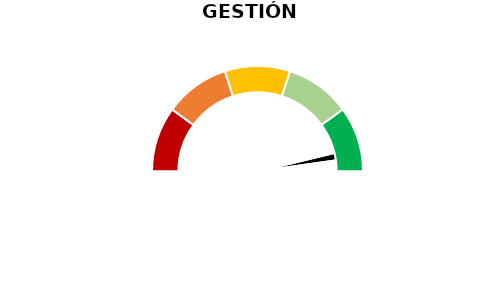
| Category | Puntero |
|---|---|
| 0 | 92.5 |
| 1 | 3 |
| 2 | 104.5 |